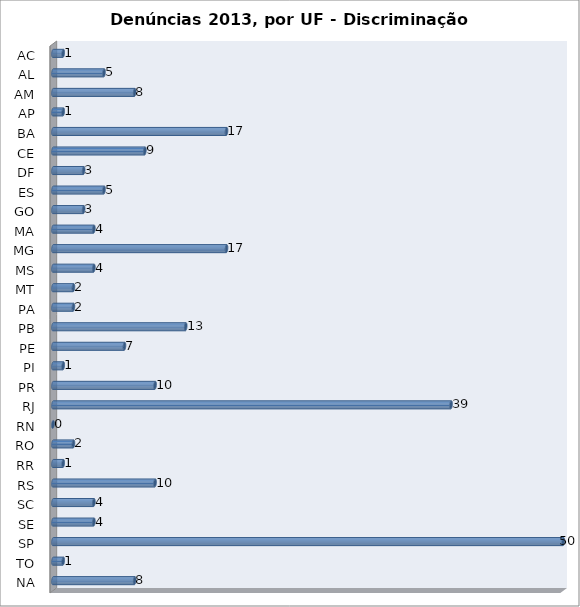
| Category | Series 0 |
|---|---|
| AC | 1 |
| AL | 5 |
| AM | 8 |
| AP | 1 |
| BA | 17 |
| CE | 9 |
| DF | 3 |
| ES | 5 |
| GO | 3 |
| MA | 4 |
| MG | 17 |
| MS | 4 |
| MT | 2 |
| PA | 2 |
| PB | 13 |
| PE | 7 |
| PI | 1 |
| PR | 10 |
| RJ | 39 |
| RN | 0 |
| RO | 2 |
| RR | 1 |
| RS | 10 |
| SC | 4 |
| SE | 4 |
| SP | 50 |
| TO | 1 |
| NA | 8 |